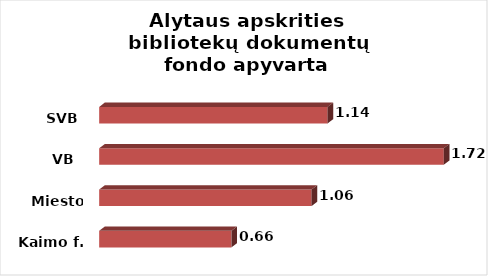
| Category | Series 0 |
|---|---|
| Kaimo f. | 0.66 |
| Miesto f. | 1.06 |
| VB  | 1.72 |
| SVB | 1.14 |